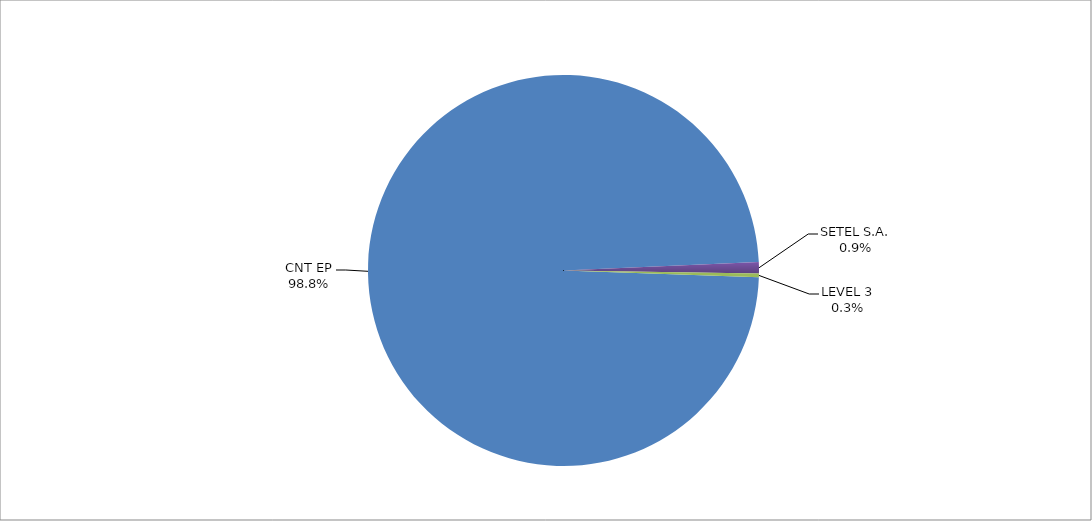
| Category | Series 0 |
|---|---|
| CNT EP | 318 |
| SETEL S.A. | 3 |
| LEVEL 3 | 1 |